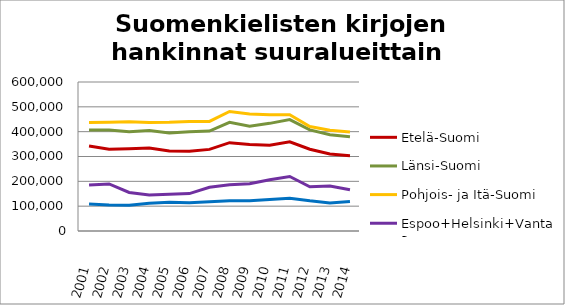
| Category | Etelä-Suomi | Länsi-Suomi | Pohjois- ja Itä-Suomi | Espoo+Helsinki+Vantaa | Muu Uusimaa |
|---|---|---|---|---|---|
| 2001.0 | 341944 | 407145 | 437390 | 185010 | 108335 |
| 2002.0 | 329111 | 406766 | 438085 | 189639 | 105106 |
| 2003.0 | 331508 | 399610 | 439871 | 155161 | 104118 |
| 2004.0 | 334633 | 404471 | 437073 | 145421 | 111355 |
| 2005.0 | 321720 | 394707 | 437791 | 148118 | 115500 |
| 2006.0 | 320774 | 399667 | 441279 | 150747 | 114014 |
| 2007.0 | 328669 | 402189 | 441292 | 176050 | 117349 |
| 2008.0 | 355750 | 437604 | 481357 | 186592 | 121574 |
| 2009.0 | 348162 | 422345 | 470913 | 190247 | 121708 |
| 2010.0 | 345695 | 433450 | 468235 | 206005 | 126681 |
| 2011.0 | 358828 | 448504 | 468585 | 219353 | 132056 |
| 2012.0 | 329446 | 407249 | 420905 | 178081 | 121377 |
| 2013.0 | 310087 | 387971 | 406081 | 181341 | 112555 |
| 2014.0 | 302902 | 379699 | 398301 | 166349 | 119092 |